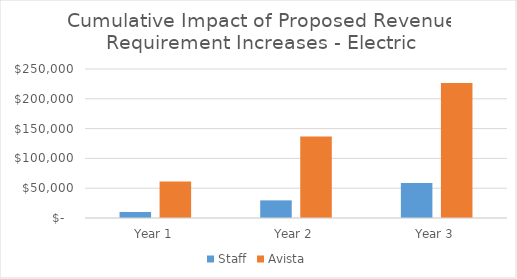
| Category | Staff | Avista |
|---|---|---|
| Year 1 | 10034.115 | 61356 |
| Year 2 | 29588.152 | 136695 |
| Year 3 | 58882.633 | 226466 |